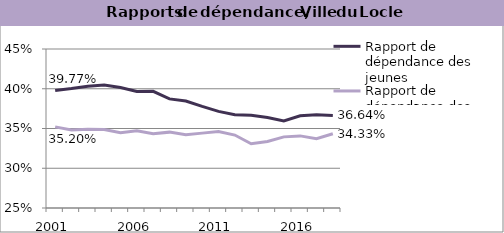
| Category | Rapport de dépendance des jeunes | Rapport de dépendance des personnes âgées |
|---|---|---|
| 2001.0 | 0.398 | 0.352 |
| 2002.0 | 0.4 | 0.348 |
| 2003.0 | 0.403 | 0.349 |
| 2004.0 | 0.405 | 0.349 |
| 2005.0 | 0.402 | 0.345 |
| 2006.0 | 0.397 | 0.347 |
| 2007.0 | 0.397 | 0.343 |
| 2008.0 | 0.387 | 0.345 |
| 2009.0 | 0.385 | 0.342 |
| 2010.0 | 0.378 | 0.344 |
| 2011.0 | 0.372 | 0.346 |
| 2012.0 | 0.367 | 0.342 |
| 2013.0 | 0.367 | 0.331 |
| 2014.0 | 0.364 | 0.334 |
| 2015.0 | 0.359 | 0.339 |
| 2016.0 | 0.366 | 0.341 |
| 2017.0 | 0.367 | 0.337 |
| 2018.0 | 0.366 | 0.343 |